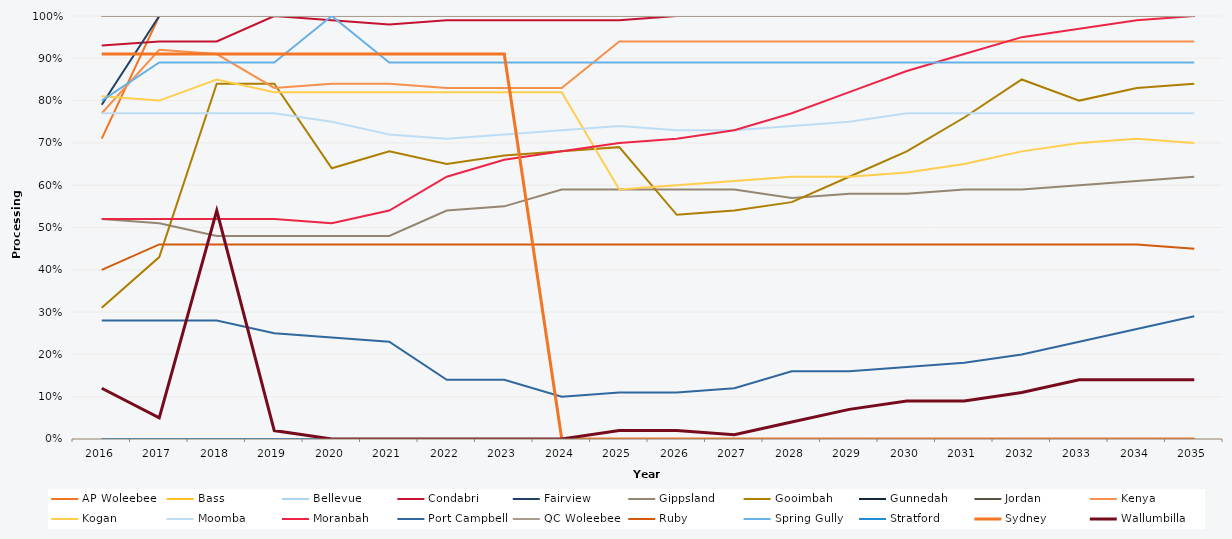
| Category | AP Woleebee | Bass | Bellevue | Condabri | Fairview | Gippsland | Gooimbah | Gunnedah | Jordan | Kenya | Kogan | Moomba | Moranbah | Port Campbell | QC Woleebee | Ruby | Spring Gully | Stratford | Sydney | Wallumbilla |
|---|---|---|---|---|---|---|---|---|---|---|---|---|---|---|---|---|---|---|---|---|
| 2016.0 | 0.71 | 1 | 1 | 0.93 | 0.79 | 0.52 | 0.31 | 0 | 1 | 0.77 | 0.81 | 0.77 | 0.52 | 0.28 | 1 | 0.4 | 0.8 | 0 | 0.91 | 0.12 |
| 2017.0 | 1 | 1 | 1 | 0.94 | 1 | 0.51 | 0.43 | 0 | 1 | 0.92 | 0.8 | 0.77 | 0.52 | 0.28 | 1 | 0.46 | 0.89 | 0 | 0.91 | 0.05 |
| 2018.0 | 1 | 1 | 1 | 0.94 | 1 | 0.48 | 0.84 | 0 | 1 | 0.91 | 0.85 | 0.77 | 0.52 | 0.28 | 1 | 0.46 | 0.89 | 0 | 0.91 | 0.54 |
| 2019.0 | 1 | 1 | 1 | 1 | 1 | 0.48 | 0.84 | 0 | 1 | 0.83 | 0.82 | 0.77 | 0.52 | 0.25 | 1 | 0.46 | 0.89 | 0 | 0.91 | 0.02 |
| 2020.0 | 1 | 1 | 1 | 0.99 | 1 | 0.48 | 0.64 | 0 | 1 | 0.84 | 0.82 | 0.75 | 0.51 | 0.24 | 1 | 0.46 | 1 | 0 | 0.91 | 0 |
| 2021.0 | 1 | 1 | 1 | 0.98 | 1 | 0.48 | 0.68 | 0 | 1 | 0.84 | 0.82 | 0.72 | 0.54 | 0.23 | 1 | 0.46 | 0.89 | 0 | 0.91 | 0 |
| 2022.0 | 1 | 1 | 1 | 0.99 | 1 | 0.54 | 0.65 | 0 | 1 | 0.83 | 0.82 | 0.71 | 0.62 | 0.14 | 1 | 0.46 | 0.89 | 0 | 0.91 | 0 |
| 2023.0 | 1 | 1 | 1 | 0.99 | 1 | 0.55 | 0.67 | 0 | 1 | 0.83 | 0.82 | 0.72 | 0.66 | 0.14 | 1 | 0.46 | 0.89 | 0 | 0.91 | 0 |
| 2024.0 | 1 | 1 | 1 | 0.99 | 1 | 0.59 | 0.68 | 0 | 1 | 0.83 | 0.82 | 0.73 | 0.68 | 0.1 | 1 | 0.46 | 0.89 | 0 | 0 | 0 |
| 2025.0 | 1 | 1 | 1 | 0.99 | 1 | 0.59 | 0.69 | 0 | 1 | 0.94 | 0.59 | 0.74 | 0.7 | 0.11 | 1 | 0.46 | 0.89 | 0 | 0 | 0.02 |
| 2026.0 | 1 | 1 | 1 | 1 | 1 | 0.59 | 0.53 | 0 | 1 | 0.94 | 0.6 | 0.73 | 0.71 | 0.11 | 1 | 0.46 | 0.89 | 0 | 0 | 0.02 |
| 2027.0 | 1 | 1 | 1 | 1 | 1 | 0.59 | 0.54 | 0 | 1 | 0.94 | 0.61 | 0.73 | 0.73 | 0.12 | 1 | 0.46 | 0.89 | 0 | 0 | 0.01 |
| 2028.0 | 1 | 1 | 1 | 1 | 1 | 0.57 | 0.56 | 0 | 1 | 0.94 | 0.62 | 0.74 | 0.77 | 0.16 | 1 | 0.46 | 0.89 | 0 | 0 | 0.04 |
| 2029.0 | 1 | 1 | 1 | 1 | 1 | 0.58 | 0.62 | 0 | 1 | 0.94 | 0.62 | 0.75 | 0.82 | 0.16 | 1 | 0.46 | 0.89 | 0 | 0 | 0.07 |
| 2030.0 | 1 | 1 | 1 | 1 | 1 | 0.58 | 0.68 | 0 | 1 | 0.94 | 0.63 | 0.77 | 0.87 | 0.17 | 1 | 0.46 | 0.89 | 0 | 0 | 0.09 |
| 2031.0 | 1 | 1 | 1 | 1 | 1 | 0.59 | 0.76 | 0 | 1 | 0.94 | 0.65 | 0.77 | 0.91 | 0.18 | 1 | 0.46 | 0.89 | 0 | 0 | 0.09 |
| 2032.0 | 1 | 1 | 1 | 1 | 1 | 0.59 | 0.85 | 0 | 1 | 0.94 | 0.68 | 0.77 | 0.95 | 0.2 | 1 | 0.46 | 0.89 | 0 | 0 | 0.11 |
| 2033.0 | 1 | 1 | 1 | 1 | 1 | 0.6 | 0.8 | 0 | 1 | 0.94 | 0.7 | 0.77 | 0.97 | 0.23 | 1 | 0.46 | 0.89 | 0 | 0 | 0.14 |
| 2034.0 | 1 | 1 | 1 | 1 | 1 | 0.61 | 0.83 | 0 | 1 | 0.94 | 0.71 | 0.77 | 0.99 | 0.26 | 1 | 0.46 | 0.89 | 0 | 0 | 0.14 |
| 2035.0 | 1 | 1 | 1 | 1 | 1 | 0.62 | 0.84 | 0 | 1 | 0.94 | 0.7 | 0.77 | 1 | 0.29 | 1 | 0.45 | 0.89 | 0 | 0 | 0.14 |